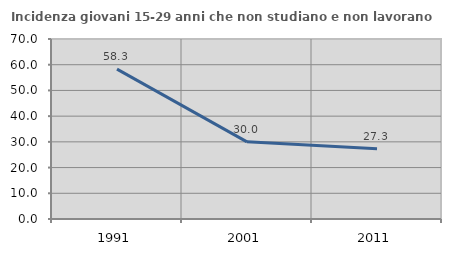
| Category | Incidenza giovani 15-29 anni che non studiano e non lavorano  |
|---|---|
| 1991.0 | 58.294 |
| 2001.0 | 30 |
| 2011.0 | 27.273 |